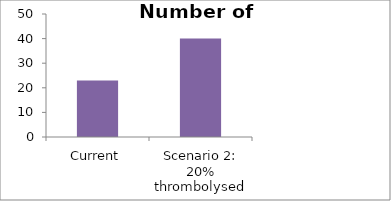
| Category | Number of patients thrombolysed |
|---|---|
| Current | 23 |
| Scenario 2: 20% thrombolysed | 40 |